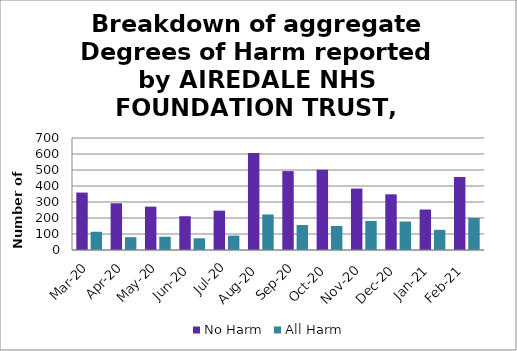
| Category | No Harm | All Harm |
|---|---|---|
| Mar-20 | 359 | 114 |
| Apr-20 | 292 | 80 |
| May-20 | 271 | 83 |
| Jun-20 | 211 | 73 |
| Jul-20 | 246 | 90 |
| Aug-20 | 606 | 222 |
| Sep-20 | 493 | 156 |
| Oct-20 | 501 | 150 |
| Nov-20 | 384 | 182 |
| Dec-20 | 348 | 178 |
| Jan-21 | 253 | 126 |
| Feb-21 | 457 | 201 |